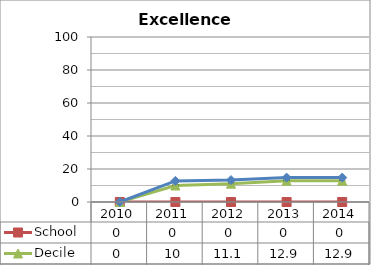
| Category | School  | Decile | National |
|---|---|---|---|
| 2010.0 | 0 | 0 | 0 |
| 2011.0 | 0 | 10 | 12.8 |
| 2012.0 | 0 | 11.1 | 13.3 |
| 2013.0 | 0 | 12.9 | 14.8 |
| 2014.0 | 0 | 12.9 | 14.8 |